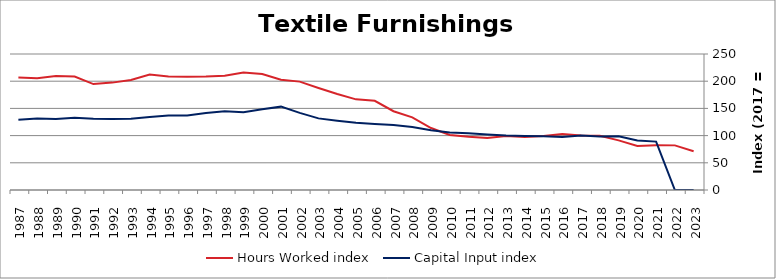
| Category | Hours Worked index | Capital Input index |
|---|---|---|
| 2023.0 | 71.331 | 0 |
| 2022.0 | 82.033 | 0 |
| 2021.0 | 82.485 | 88.959 |
| 2020.0 | 81.041 | 90.86 |
| 2019.0 | 91.26 | 98.633 |
| 2018.0 | 99.536 | 98.537 |
| 2017.0 | 100 | 100 |
| 2016.0 | 102.854 | 97.255 |
| 2015.0 | 99.048 | 98.88 |
| 2014.0 | 97.57 | 99.165 |
| 2013.0 | 99.301 | 100.054 |
| 2012.0 | 95.776 | 101.854 |
| 2011.0 | 97.928 | 104.339 |
| 2010.0 | 101.095 | 105.648 |
| 2009.0 | 113.92 | 109.666 |
| 2008.0 | 133.522 | 115.65 |
| 2007.0 | 144.776 | 119.297 |
| 2006.0 | 163.968 | 121.539 |
| 2005.0 | 166.63 | 123.772 |
| 2004.0 | 176.587 | 127.481 |
| 2003.0 | 187.598 | 131.661 |
| 2002.0 | 199.223 | 141.742 |
| 2001.0 | 202.524 | 153.236 |
| 2000.0 | 213.082 | 148.507 |
| 1999.0 | 215.888 | 142.937 |
| 1998.0 | 210.157 | 144.967 |
| 1997.0 | 208.661 | 141.391 |
| 1996.0 | 208.2 | 137.111 |
| 1995.0 | 208.673 | 136.798 |
| 1994.0 | 212.358 | 133.994 |
| 1993.0 | 202.248 | 131.193 |
| 1992.0 | 197.389 | 130.689 |
| 1991.0 | 194.666 | 131.124 |
| 1990.0 | 208.535 | 132.607 |
| 1989.0 | 209.695 | 130.49 |
| 1988.0 | 205.366 | 131.291 |
| 1987.0 | 206.727 | 129.342 |